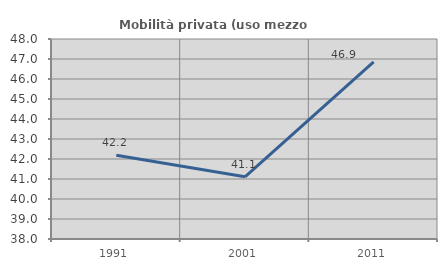
| Category | Mobilità privata (uso mezzo privato) |
|---|---|
| 1991.0 | 42.185 |
| 2001.0 | 41.107 |
| 2011.0 | 46.851 |